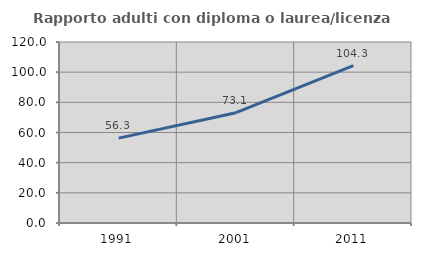
| Category | Rapporto adulti con diploma o laurea/licenza media  |
|---|---|
| 1991.0 | 56.25 |
| 2001.0 | 73.138 |
| 2011.0 | 104.337 |